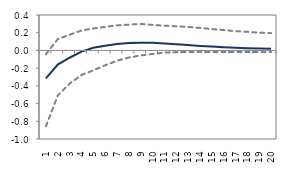
| Category | lower bound | median | upper bound |
|---|---|---|---|
| 1.0 | -0.856 | -0.315 | -0.043 |
| 2.0 | -0.509 | -0.16 | 0.127 |
| 3.0 | -0.375 | -0.083 | 0.177 |
| 4.0 | -0.277 | -0.013 | 0.224 |
| 5.0 | -0.225 | 0.03 | 0.248 |
| 6.0 | -0.168 | 0.054 | 0.265 |
| 7.0 | -0.117 | 0.072 | 0.283 |
| 8.0 | -0.079 | 0.085 | 0.291 |
| 9.0 | -0.057 | 0.088 | 0.3 |
| 10.0 | -0.04 | 0.086 | 0.288 |
| 11.0 | -0.025 | 0.078 | 0.28 |
| 12.0 | -0.02 | 0.069 | 0.273 |
| 13.0 | -0.018 | 0.06 | 0.265 |
| 14.0 | -0.016 | 0.051 | 0.254 |
| 15.0 | -0.016 | 0.044 | 0.242 |
| 16.0 | -0.017 | 0.037 | 0.23 |
| 17.0 | -0.018 | 0.031 | 0.218 |
| 18.0 | -0.018 | 0.026 | 0.21 |
| 19.0 | -0.018 | 0.022 | 0.201 |
| 20.0 | -0.019 | 0.018 | 0.195 |